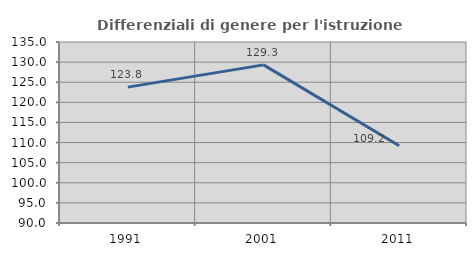
| Category | Differenziali di genere per l'istruzione superiore |
|---|---|
| 1991.0 | 123.782 |
| 2001.0 | 129.308 |
| 2011.0 | 109.21 |